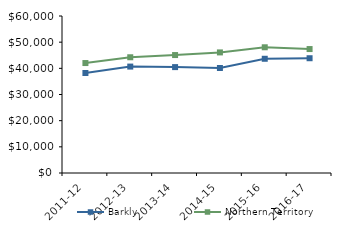
| Category | Barkly | Northern Territory |
|---|---|---|
| 2011-12 | 38211.76 | 42021 |
| 2012-13 | 40669.77 | 44232.02 |
| 2013-14 | 40468 | 45075.51 |
| 2014-15 | 40135.74 | 46083.65 |
| 2015-16 | 43653.95 | 48046.27 |
| 2016-17 | 43862.32 | 47367.05 |